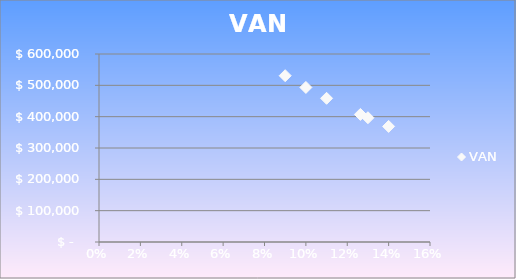
| Category | VAN |
|---|---|
| 0.09 | 530756.169 |
| 0.1 | 493268.121 |
| 0.11 | 458568.107 |
| 0.12636290485423657 | 407180.845 |
| 0.13 | 396589.859 |
| 0.14 | 368896.586 |